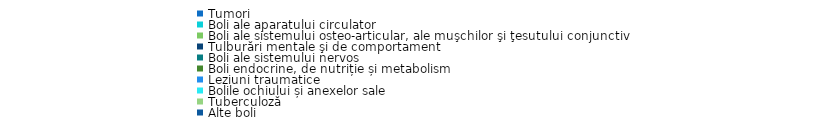
| Category | Urban |
|---|---|
| Tumori  | 19.3 |
| Boli ale aparatului circulator | 15.5 |
| Boli ale sistemului osteo-articular, ale muşchilor şi ţesutului conjunctiv | 14.5 |
| Tulburări mentale şi de comportament | 11.1 |
| Boli ale sistemului nervos | 7.7 |
| Boli endocrine, de nutriție și metabolism | 7 |
| Leziuni traumatice  | 4.5 |
| Bolile ochiului și anexelor sale | 3.2 |
| Tuberculoză | 2.3 |
| Alte boli | 14.9 |